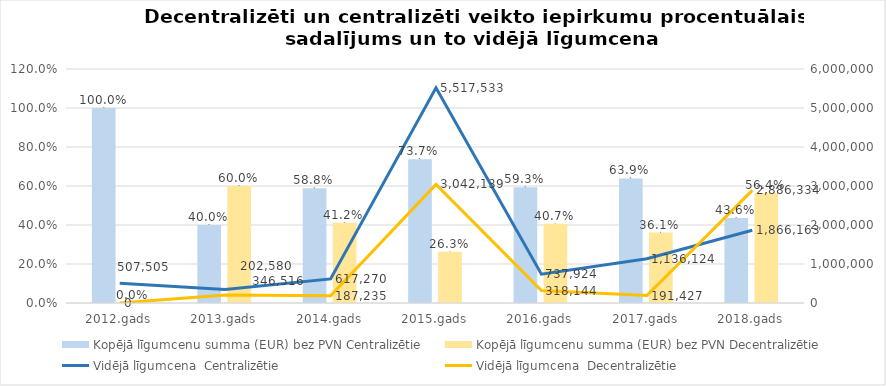
| Category | Kopējā līgumcenu summa (EUR) bez PVN |
|---|---|
| 2012.gads | 0 |
| 2013.gads | 0.6 |
| 2014.gads | 0.412 |
| 2015.gads | 0.263 |
| 2016.gads | 0.407 |
| 2017.gads | 0.361 |
| 2018.gads | 0.564 |